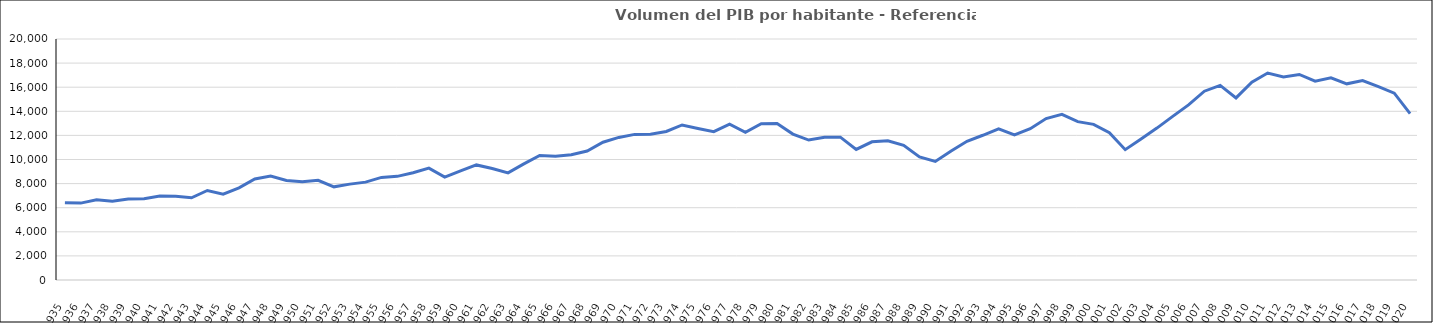
| Category | Volumen del PIB por habitante |
|---|---|
| 1935.0 | 6417.385 |
| 1936.0 | 6381.848 |
| 1937.0 | 6666.974 |
| 1938.0 | 6539.576 |
| 1939.0 | 6715.947 |
| 1940.0 | 6748.885 |
| 1941.0 | 6975.45 |
| 1942.0 | 6955.742 |
| 1943.0 | 6824.654 |
| 1944.0 | 7430.375 |
| 1945.0 | 7124.751 |
| 1946.0 | 7642.236 |
| 1947.0 | 8384.921 |
| 1948.0 | 8619.919 |
| 1949.0 | 8254.205 |
| 1950.0 | 8144.795 |
| 1951.0 | 8277.751 |
| 1952.0 | 7730.265 |
| 1953.0 | 7956.966 |
| 1954.0 | 8122.725 |
| 1955.0 | 8515.805 |
| 1956.0 | 8602.32 |
| 1957.0 | 8895.138 |
| 1958.0 | 9279.649 |
| 1959.0 | 8533.365 |
| 1960.0 | 9058.7 |
| 1961.0 | 9548.892 |
| 1962.0 | 9247.786 |
| 1963.0 | 8886.439 |
| 1964.0 | 9634.421 |
| 1965.0 | 10338.413 |
| 1966.0 | 10266.711 |
| 1967.0 | 10390.652 |
| 1968.0 | 10707.326 |
| 1969.0 | 11431.236 |
| 1970.0 | 11831.233 |
| 1971.0 | 12083.128 |
| 1972.0 | 12103.023 |
| 1973.0 | 12328.692 |
| 1974.0 | 12867.66 |
| 1975.0 | 12578.352 |
| 1976.0 | 12306.306 |
| 1977.0 | 12936.5 |
| 1978.0 | 12253.049 |
| 1979.0 | 12968.692 |
| 1980.0 | 12977.962 |
| 1981.0 | 12112.705 |
| 1982.0 | 11612.924 |
| 1983.0 | 11853.405 |
| 1984.0 | 11853.434 |
| 1985.0 | 10839.817 |
| 1986.0 | 11466.515 |
| 1987.0 | 11558.688 |
| 1988.0 | 11177.207 |
| 1989.0 | 10219.884 |
| 1990.0 | 9835.669 |
| 1991.0 | 10710.627 |
| 1992.0 | 11508.869 |
| 1993.0 | 12010.437 |
| 1994.0 | 12548.05 |
| 1995.0 | 12037.698 |
| 1996.0 | 12551.91 |
| 1997.0 | 13401.357 |
| 1998.0 | 13751.038 |
| 1999.0 | 13142.312 |
| 2000.0 | 12914.458 |
| 2001.0 | 12231.75 |
| 2002.0 | 10816.722 |
| 2003.0 | 11707.973 |
| 2004.0 | 12606.845 |
| 2005.0 | 13581.434 |
| 2006.0 | 14536.197 |
| 2007.0 | 15668.742 |
| 2008.0 | 16149.73 |
| 2009.0 | 15112.3 |
| 2010.0 | 16411.394 |
| 2011.0 | 17176.88 |
| 2012.0 | 16856.236 |
| 2013.0 | 17058.924 |
| 2014.0 | 16501.217 |
| 2015.0 | 16773.095 |
| 2016.0 | 16280.405 |
| 2017.0 | 16557.179 |
| 2018.0 | 16054.739 |
| 2019.0 | 15504.299 |
| 2020.0 | 13811.55 |